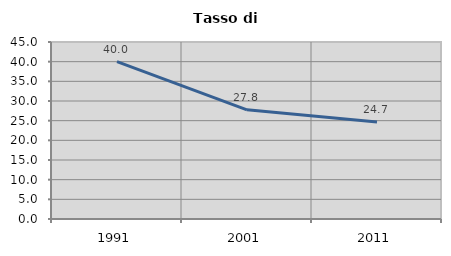
| Category | Tasso di disoccupazione   |
|---|---|
| 1991.0 | 40.018 |
| 2001.0 | 27.765 |
| 2011.0 | 24.681 |